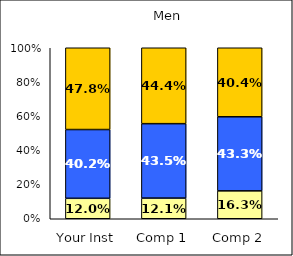
| Category | Low Positive Cross-Racial Interaction | Average Positive Cross-Racial Interaction | High Positive Cross-Racial Interaction |
|---|---|---|---|
| Your Inst | 0.12 | 0.402 | 0.478 |
| Comp 1 | 0.121 | 0.435 | 0.444 |
| Comp 2 | 0.163 | 0.433 | 0.404 |